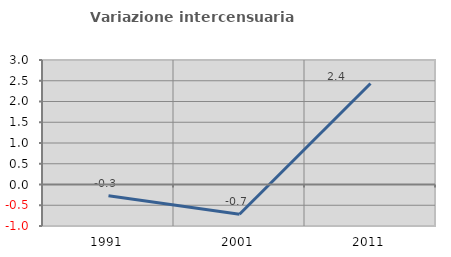
| Category | Variazione intercensuaria annua |
|---|---|
| 1991.0 | -0.269 |
| 2001.0 | -0.718 |
| 2011.0 | 2.435 |